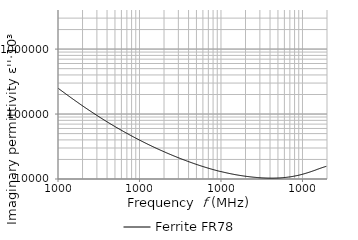
| Category | Ferrite FR78 |
|---|---|
| 10000.0 | 250666.764 |
| 10192.3 | 246181.217 |
| 10388.3 | 241591.13 |
| 10588.1 | 237337.921 |
| 10791.8 | 233174.034 |
| 10999.3 | 229084.378 |
| 11210.9 | 225073.279 |
| 11426.5 | 221128.293 |
| 11646.2 | 217276.071 |
| 11870.2 | 213493.191 |
| 12098.5 | 209781.427 |
| 12331.2 | 206135.917 |
| 12568.4 | 202574.357 |
| 12810.1 | 199083.807 |
| 13056.5 | 195656.507 |
| 13307.6 | 192293.301 |
| 13563.5 | 188994.861 |
| 13824.4 | 185771.578 |
| 14090.2 | 182590.507 |
| 14361.2 | 179472.958 |
| 14637.4 | 176417.408 |
| 14919.0 | 173418.703 |
| 15205.9 | 170475.466 |
| 15498.3 | 167592.931 |
| 15796.4 | 164765.603 |
| 16100.2 | 161994.617 |
| 16409.9 | 159282.483 |
| 16725.5 | 156623.621 |
| 17047.1 | 154005.627 |
| 17375.0 | 151437.417 |
| 17709.2 | 148914.073 |
| 18049.7 | 146429.339 |
| 18396.9 | 143986.777 |
| 18750.7 | 141606.94 |
| 19111.3 | 139284.83 |
| 19478.9 | 136990.081 |
| 19853.5 | 134720.204 |
| 20235.3 | 132501.045 |
| 20624.5 | 130342.523 |
| 21021.2 | 128223.694 |
| 21425.5 | 126148.486 |
| 21837.5 | 124114.751 |
| 22257.5 | 122129.306 |
| 22685.6 | 120183.397 |
| 23121.9 | 118271.362 |
| 23566.6 | 116387.831 |
| 24019.8 | 114538.336 |
| 24481.8 | 112727.039 |
| 24952.6 | 110953.349 |
| 25432.5 | 109208.155 |
| 25921.7 | 107499.431 |
| 26420.2 | 105812.37 |
| 26928.3 | 104164.602 |
| 27446.2 | 102545.8 |
| 27974.1 | 100958.778 |
| 28512.1 | 99388.904 |
| 29060.5 | 97849.773 |
| 29619.4 | 96337.396 |
| 30189.0 | 94847.409 |
| 30769.6 | 93392.359 |
| 31361.4 | 91958.659 |
| 31964.6 | 90557.513 |
| 32579.3 | 89184.172 |
| 33205.9 | 87836.01 |
| 33844.5 | 86512.511 |
| 34495.4 | 85219.087 |
| 35158.9 | 83952.792 |
| 35835.1 | 82704.084 |
| 36524.3 | 81480.269 |
| 37226.7 | 80280.556 |
| 37942.7 | 79099.709 |
| 38672.4 | 77936.976 |
| 39416.2 | 76797.406 |
| 40174.3 | 75682.453 |
| 40946.9 | 74587.084 |
| 41734.4 | 73504.879 |
| 42537.1 | 72439.13 |
| 43355.2 | 71395.712 |
| 44189.0 | 70380.975 |
| 45038.9 | 69378.585 |
| 45905.1 | 68389.663 |
| 46787.9 | 67414.679 |
| 47687.8 | 66464.694 |
| 48604.9 | 65532.054 |
| 49539.7 | 64614.169 |
| 50492.5 | 63715.004 |
| 51463.6 | 62828.106 |
| 52453.4 | 61958.026 |
| 53462.2 | 61106.741 |
| 54490.4 | 60269.766 |
| 55538.4 | 59446.409 |
| 56606.5 | 58632.552 |
| 57695.2 | 57830.189 |
| 58804.8 | 57044.801 |
| 59935.8 | 56275.156 |
| 61088.5 | 55517.762 |
| 62263.4 | 54774.611 |
| 63460.9 | 54041.86 |
| 64681.4 | 53326.816 |
| 65925.4 | 52619.055 |
| 67193.3 | 51924.197 |
| 68485.6 | 51243.708 |
| 69802.7 | 50569.484 |
| 71145.2 | 49906.202 |
| 72513.5 | 49248.498 |
| 73908.1 | 48605.936 |
| 75329.5 | 47975.601 |
| 76778.3 | 47358.859 |
| 78255.0 | 46753.705 |
| 79760.0 | 46156.518 |
| 81294.0 | 45572.18 |
| 82857.5 | 44997.879 |
| 84451.0 | 44430.659 |
| 86075.2 | 43868.125 |
| 87730.7 | 43319.095 |
| 89417.9 | 42780.725 |
| 91137.7 | 42251.935 |
| 92890.5 | 41726.243 |
| 94677.0 | 41212.371 |
| 96497.9 | 40706.112 |
| 98353.8 | 40208.603 |
| 100245.0 | 39710.63 |
| 102173.0 | 39227.057 |
| 104138.0 | 38750.676 |
| 106141.0 | 38280.137 |
| 108183.0 | 37815.973 |
| 110263.0 | 37364.341 |
| 112384.0 | 36919.731 |
| 114545.0 | 36479.437 |
| 116748.0 | 36048.254 |
| 118994.0 | 35623.242 |
| 121282.0 | 35205.197 |
| 123615.0 | 34793.314 |
| 125992.0 | 34392.017 |
| 128415.0 | 33989.876 |
| 130885.0 | 33593.579 |
| 133402.0 | 33207.7 |
| 135968.0 | 32887.825 |
| 138583.0 | 32455.262 |
| 141248.0 | 32089.302 |
| 143965.0 | 31729.246 |
| 146734.0 | 31371.473 |
| 149556.0 | 31022.076 |
| 152432.0 | 30675.761 |
| 155364.0 | 30334.683 |
| 158352.0 | 30003.233 |
| 161397.0 | 29670.831 |
| 164501.0 | 29347.005 |
| 167665.0 | 29027.827 |
| 170890.0 | 28712.25 |
| 174176.0 | 28400.737 |
| 177526.0 | 28096.272 |
| 180940.0 | 27797.99 |
| 184420.0 | 27502.006 |
| 187967.0 | 27211.435 |
| 191582.0 | 26925.337 |
| 195267.0 | 26640.529 |
| 199022.0 | 26363.289 |
| 202850.0 | 26089.063 |
| 206751.0 | 25818.579 |
| 210728.0 | 25550.815 |
| 214780.0 | 25287.95 |
| 218911.0 | 25025.566 |
| 223121.0 | 24768.274 |
| 227413.0 | 24516.203 |
| 231786.0 | 24269.393 |
| 236244.0 | 24026.501 |
| 240788.0 | 23786.269 |
| 245419.0 | 23548.941 |
| 250139.0 | 23314.686 |
| 254949.0 | 23087.683 |
| 259853.0 | 22858.701 |
| 264850.0 | 22633.889 |
| 269944.0 | 22412.559 |
| 275136.0 | 22197.368 |
| 280427.0 | 21982.831 |
| 285821.0 | 21768.662 |
| 291318.0 | 21559.101 |
| 296920.0 | 21354.292 |
| 302631.0 | 21153.108 |
| 308451.0 | 20953.001 |
| 314383.0 | 20758.302 |
| 320430.0 | 20564.964 |
| 326593.0 | 20375.738 |
| 332874.0 | 20190.184 |
| 339276.0 | 20005.926 |
| 345801.0 | 19822.889 |
| 352451.0 | 19643.545 |
| 359230.0 | 19467.336 |
| 366139.0 | 19293.882 |
| 373181.0 | 19123.133 |
| 380358.0 | 18961.02 |
| 387673.0 | 18790.74 |
| 395129.0 | 18626.969 |
| 402728.0 | 18466.39 |
| 410474.0 | 18308.346 |
| 418368.0 | 18149.986 |
| 426414.0 | 17995.73 |
| 434615.0 | 17840.379 |
| 442974.0 | 17688.43 |
| 451494.0 | 17539.822 |
| 460177.0 | 17392.566 |
| 469027.0 | 17247.19 |
| 478048.0 | 17104.423 |
| 487242.0 | 16964.439 |
| 496613.0 | 16826.552 |
| 506164.0 | 16691.223 |
| 515899.0 | 16556.755 |
| 525821.0 | 16422.488 |
| 535934.0 | 16292.923 |
| 546241.0 | 16164.091 |
| 556746.0 | 16037.008 |
| 567454.0 | 15912.316 |
| 578368.0 | 15789.167 |
| 589491.0 | 15681.494 |
| 600828.0 | 15550.41 |
| 612384.0 | 15434.425 |
| 624162.0 | 15320.482 |
| 636166.0 | 15204.734 |
| 648401.0 | 15094.166 |
| 660871.0 | 14984.988 |
| 673581.0 | 14874.837 |
| 686536.0 | 14770.652 |
| 699740.0 | 14664.83 |
| 713198.0 | 14560.983 |
| 726914.0 | 14458.102 |
| 740894.0 | 14356.126 |
| 755144.0 | 14258.569 |
| 769667.0 | 14161.604 |
| 784470.0 | 14064.437 |
| 799557.0 | 13970.726 |
| 814934.0 | 13878.265 |
| 830608.0 | 13785.573 |
| 846582.0 | 13697.151 |
| 862864.0 | 13607.926 |
| 879459.0 | 13520.809 |
| 896373.0 | 13435.682 |
| 913613.0 | 13351.896 |
| 931184.0 | 13270.53 |
| 949093.0 | 13188.9 |
| 967346.0 | 13108.52 |
| 985951.0 | 13029.005 |
| 1004910.0 | 12992.252 |
| 1024240.0 | 12917.183 |
| 1043940.0 | 12842.741 |
| 1064020.0 | 12770.932 |
| 1084480.0 | 12700.53 |
| 1105340.0 | 12631.301 |
| 1126600.0 | 12563.082 |
| 1148260.0 | 12495.889 |
| 1170350.0 | 12427.851 |
| 1192860.0 | 12362.907 |
| 1215800.0 | 12299.267 |
| 1239180.0 | 12237.913 |
| 1263010.0 | 12175.79 |
| 1287300.0 | 12114.107 |
| 1312060.0 | 12054.281 |
| 1337300.0 | 11994.598 |
| 1363010.0 | 11940.29 |
| 1389230.0 | 11884.529 |
| 1415950.0 | 11829.378 |
| 1443180.0 | 11775.713 |
| 1470940.0 | 11720.661 |
| 1499230.0 | 11669.822 |
| 1528060.0 | 11621.108 |
| 1557450.0 | 11573.376 |
| 1587400.0 | 11525.834 |
| 1617930.0 | 11477.187 |
| 1649050.0 | 11432.211 |
| 1680760.0 | 11386.336 |
| 1713090.0 | 11345.42 |
| 1746040.0 | 11300.682 |
| 1779620.0 | 11259.895 |
| 1813840.0 | 11217.774 |
| 1848730.0 | 11178.06 |
| 1884280.0 | 11139.954 |
| 1920520.0 | 11101.627 |
| 1957460.0 | 11065.783 |
| 1995110.0 | 11028.113 |
| 2033480.0 | 10992.968 |
| 2072580.0 | 10958.285 |
| 2112450.0 | 10923.048 |
| 2153070.0 | 10892.034 |
| 2194480.0 | 10860.979 |
| 2236690.0 | 10830.302 |
| 2279700.0 | 10800.224 |
| 2323550.0 | 10770.724 |
| 2368240.0 | 10742.005 |
| 2413780.0 | 10715.285 |
| 2460210.0 | 10689.173 |
| 2507520.0 | 10662.705 |
| 2555750.0 | 10637.158 |
| 2604900.0 | 10613.616 |
| 2655000.0 | 10590.567 |
| 2706060.0 | 10569.107 |
| 2758110.0 | 10547.869 |
| 2811150.0 | 10526.417 |
| 2865220.0 | 10507.631 |
| 2920320.0 | 10487.226 |
| 2976490.0 | 10468.507 |
| 3033730.0 | 10453.971 |
| 3092080.0 | 10438.033 |
| 3151550.0 | 10423.627 |
| 3212160.0 | 10408.548 |
| 3273940.0 | 10395.316 |
| 3336900.0 | 10384.185 |
| 3401080.0 | 10372.86 |
| 3466490.0 | 10362.641 |
| 3533160.0 | 10352.87 |
| 3601110.0 | 10344.519 |
| 3670370.0 | 10335.413 |
| 3740960.0 | 10327.943 |
| 3812910.0 | 10323.13 |
| 3886240.0 | 10317.633 |
| 3960980.0 | 10313.654 |
| 4037160.0 | 10312.826 |
| 4114810.0 | 10311.598 |
| 4193950.0 | 10311.53 |
| 4274610.0 | 10311.786 |
| 4356820.0 | 10313.471 |
| 4440610.0 | 10316.088 |
| 4526010.0 | 10321.321 |
| 4613060.0 | 10326.405 |
| 4701780.0 | 10332.856 |
| 4792210.0 | 10340.966 |
| 4884370.0 | 10349.015 |
| 4978310.0 | 10358.635 |
| 5074060.0 | 10369.421 |
| 5171640.0 | 10382.895 |
| 5271110.0 | 10398.631 |
| 5372480.0 | 10413.345 |
| 5475810.0 | 10431.259 |
| 5581120.0 | 10451.291 |
| 5688460.0 | 10472.281 |
| 5797870.0 | 10491.007 |
| 5909370.0 | 10511.467 |
| 6023030.0 | 10536.525 |
| 6138860.0 | 10561.267 |
| 6256930.0 | 10589.032 |
| 6377270.0 | 10616.446 |
| 6499920.0 | 10646.59 |
| 6624930.0 | 10677.98 |
| 6752340.0 | 10712.004 |
| 6882200.0 | 10744.288 |
| 7014570.0 | 10779.746 |
| 7149470.0 | 10820.411 |
| 7286980.0 | 10861.312 |
| 7427120.0 | 10905.125 |
| 7569960.0 | 10948.475 |
| 7715550.0 | 10995.066 |
| 7863940.0 | 11043.154 |
| 8015190.0 | 11093.7 |
| 8169340.0 | 11148.287 |
| 8326450.0 | 11203.245 |
| 8486590.0 | 11257.642 |
| 8649810.0 | 11313.113 |
| 8816170.0 | 11371.582 |
| 8985730.0 | 11433.999 |
| 9158540.0 | 11500.333 |
| 9334690.0 | 11570.391 |
| 9514210.0 | 11643.552 |
| 9697200.0 | 11716.169 |
| 9883700.0 | 11791.169 |
| 10073800.0 | 11868.331 |
| 10267500.0 | 11947.454 |
| 10465000.0 | 12026.276 |
| 10666300.0 | 12109.516 |
| 10871400.0 | 12192.943 |
| 11080500.0 | 12281.542 |
| 11293600.0 | 12372.202 |
| 11510800.0 | 12464.188 |
| 11732200.0 | 12558.289 |
| 11957800.0 | 12655.336 |
| 12187800.0 | 12751.932 |
| 12422200.0 | 12855.056 |
| 12661100.0 | 12958.809 |
| 12904600.0 | 13065.037 |
| 13152800.0 | 13173.756 |
| 13405800.0 | 13281.598 |
| 13663600.0 | 13391.177 |
| 13926400.0 | 13504.508 |
| 14194200.0 | 13618.144 |
| 14467200.0 | 13735.42 |
| 14745400.0 | 13851.503 |
| 15029000.0 | 14005.058 |
| 15318100.0 | 14124.514 |
| 15612700.0 | 14243.474 |
| 15913000.0 | 14364.325 |
| 16219000.0 | 14486.123 |
| 16530900.0 | 14609.91 |
| 16848900.0 | 14730.525 |
| 17172900.0 | 14853.32 |
| 17503200.0 | 14973.773 |
| 17839800.0 | 15091.833 |
| 18182900.0 | 15210.626 |
| 18532600.0 | 15331.412 |
| 18889100.0 | 15446.141 |
| 19252300.0 | 15560.562 |
| 19622600.0 | 15670.475 |